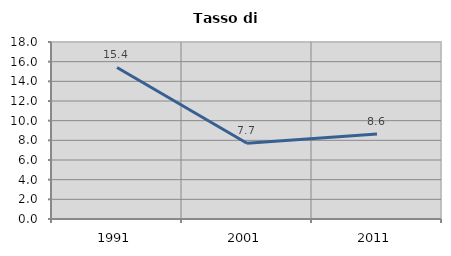
| Category | Tasso di disoccupazione   |
|---|---|
| 1991.0 | 15.41 |
| 2001.0 | 7.708 |
| 2011.0 | 8.646 |